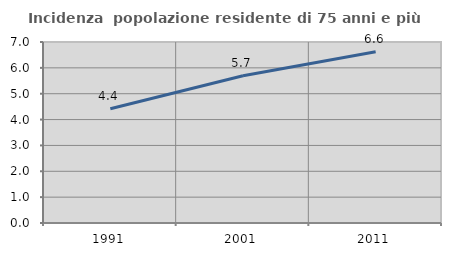
| Category | Incidenza  popolazione residente di 75 anni e più |
|---|---|
| 1991.0 | 4.419 |
| 2001.0 | 5.693 |
| 2011.0 | 6.625 |